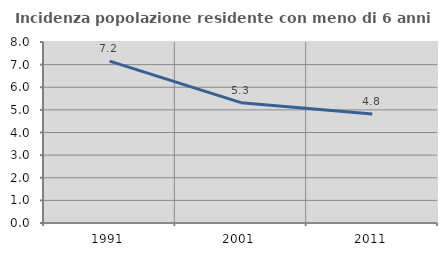
| Category | Incidenza popolazione residente con meno di 6 anni |
|---|---|
| 1991.0 | 7.155 |
| 2001.0 | 5.318 |
| 2011.0 | 4.817 |